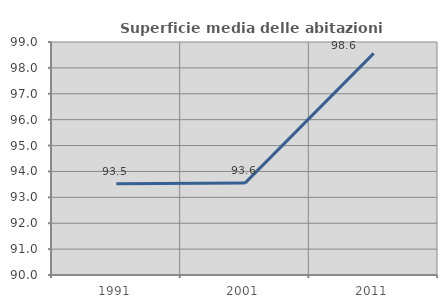
| Category | Superficie media delle abitazioni occupate |
|---|---|
| 1991.0 | 93.521 |
| 2001.0 | 93.551 |
| 2011.0 | 98.561 |